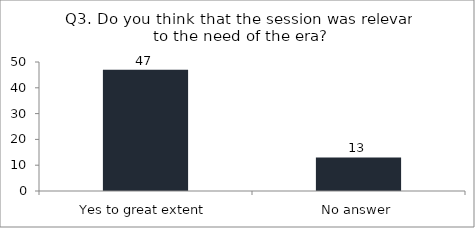
| Category | Q3. Do you think that the session was relevant to the need of the era? |
|---|---|
| Yes to great extent | 47 |
| No answer | 13 |